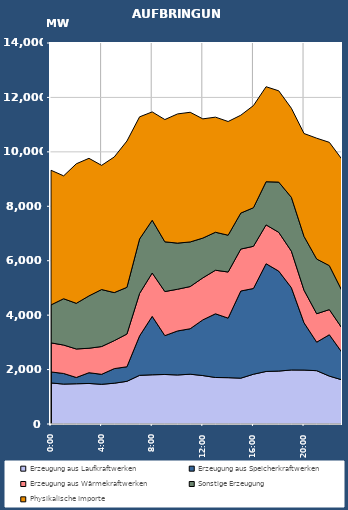
| Category | Erzeugung aus Laufkraftwerken | Erzeugung aus Speicherkraftwerken | Erzeugung aus Wärmekraftwerken | Sonstige Erzeugung | Physikalische Importe |
|---|---|---|---|---|---|
| 2007-01-17 | 1507.795 | 404.971 | 1068.569 | 1395.335 | 4947.849 |
| 2007-01-17 01:00:00 | 1466.584 | 390.13 | 1044.176 | 1702.319 | 4515.261 |
| 2007-01-17 02:00:00 | 1478.883 | 230.277 | 1047.357 | 1678.018 | 5126.977 |
| 2007-01-17 03:00:00 | 1489.889 | 394.518 | 899.363 | 1923.099 | 5055.509 |
| 2007-01-17 04:00:00 | 1459.22 | 366.227 | 1020.802 | 2094.324 | 4563.273 |
| 2007-01-17 05:00:00 | 1499.014 | 535.3 | 1028.402 | 1765.524 | 4984.393 |
| 2007-01-17 06:00:00 | 1568.089 | 535.447 | 1201.939 | 1715.889 | 5375.925 |
| 2007-01-17 07:00:00 | 1788.413 | 1448.163 | 1560.142 | 2001.238 | 4488.125 |
| 2007-01-17 08:00:00 | 1808.171 | 2147.077 | 1593.282 | 1938.216 | 3981.285 |
| 2007-01-17 09:00:00 | 1819.623 | 1427.106 | 1620.335 | 1827.27 | 4492.485 |
| 2007-01-17 10:00:00 | 1801.855 | 1617.087 | 1532.808 | 1694.616 | 4747.345 |
| 2007-01-17 11:00:00 | 1829.635 | 1670.931 | 1549.959 | 1639.332 | 4764.885 |
| 2007-01-17 12:00:00 | 1780.169 | 2045.9 | 1543.651 | 1461.799 | 4380.985 |
| 2007-01-17 13:00:00 | 1709.229 | 2340.42 | 1600.768 | 1395.842 | 4228.845 |
| 2007-01-17 14:00:00 | 1702.887 | 2187.484 | 1694.894 | 1351.653 | 4178.525 |
| 2007-01-17 15:00:00 | 1684.23 | 3202.9 | 1540.585 | 1322.982 | 3595.645 |
| 2007-01-17 16:00:00 | 1828.677 | 3150.756 | 1550.235 | 1417.457 | 3752.545 |
| 2007-01-17 17:00:00 | 1930.83 | 3958.316 | 1427.494 | 1585.582 | 3491.005 |
| 2007-01-17 18:00:00 | 1945.117 | 3672.766 | 1425.219 | 1845.658 | 3353.785 |
| 2007-01-17 19:00:00 | 1985.179 | 3022.866 | 1342.089 | 1978.444 | 3272.425 |
| 2007-01-17 20:00:00 | 1982.315 | 1736.408 | 1197.145 | 1977.33 | 3780.925 |
| 2007-01-17 21:00:00 | 1959.537 | 1048.049 | 1044.262 | 2010.294 | 4439.845 |
| 2007-01-17 22:00:00 | 1760.488 | 1519.273 | 924.037 | 1615.224 | 4530.405 |
| 2007-01-17 23:00:00 | 1622.234 | 1007.122 | 892.202 | 1373.917 | 4828.625 |